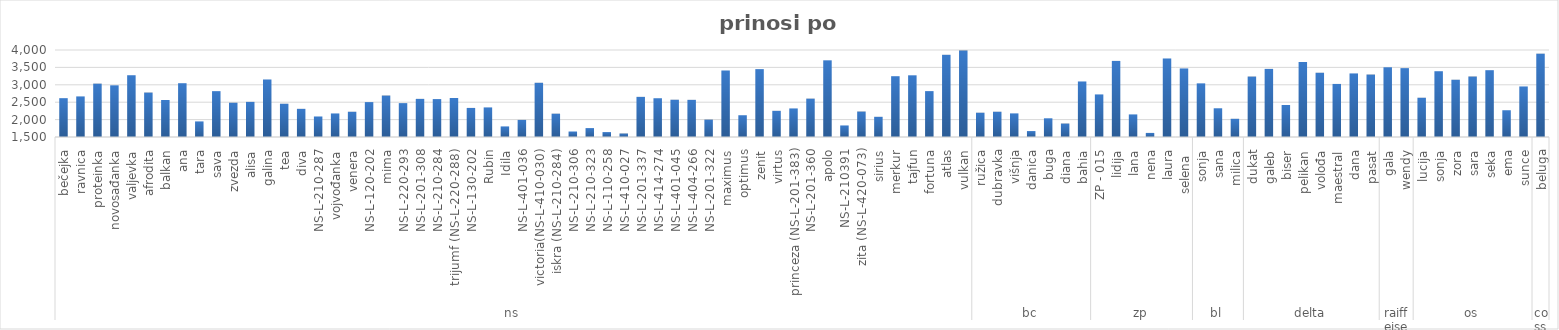
| Category | Series 0 |
|---|---|
| 0 | 2615.836 |
| 1 | 2666.375 |
| 2 | 3033 |
| 3 | 2985 |
| 4 | 3274.849 |
| 5 | 2776.475 |
| 6 | 2563.597 |
| 7 | 3045.533 |
| 8 | 1948.067 |
| 9 | 2817.53 |
| 10 | 2484.667 |
| 11 | 2509.4 |
| 12 | 3152.807 |
| 13 | 2455.667 |
| 14 | 2309.083 |
| 15 | 2089.7 |
| 16 | 2176.988 |
| 17 | 2225.3 |
| 18 | 2502.95 |
| 19 | 2690.633 |
| 20 | 2473.5 |
| 21 | 2595.6 |
| 22 | 2589.7 |
| 23 | 2621.567 |
| 24 | 2335.5 |
| 25 | 2350.175 |
| 26 | 1804.226 |
| 27 | 1991 |
| 28 | 3057.953 |
| 29 | 2169.867 |
| 30 | 1658 |
| 31 | 1756 |
| 32 | 1641 |
| 33 | 1600 |
| 34 | 2653.291 |
| 35 | 2613.821 |
| 36 | 2570.741 |
| 37 | 2567.559 |
| 38 | 1999.275 |
| 39 | 3411.469 |
| 40 | 2125.5 |
| 41 | 3450.5 |
| 42 | 2252 |
| 43 | 2321 |
| 44 | 2602 |
| 45 | 3703.48 |
| 46 | 1832 |
| 47 | 2231 |
| 48 | 2080 |
| 49 | 3246.954 |
| 50 | 3272.827 |
| 51 | 2818.667 |
| 52 | 3861.944 |
| 53 | 3982.56 |
| 54 | 2197.71 |
| 55 | 2225.87 |
| 56 | 2178.6 |
| 57 | 1670.31 |
| 58 | 2037.4 |
| 59 | 1886.2 |
| 60 | 3095.8 |
| 61 | 2723.6 |
| 62 | 3686.6 |
| 63 | 2149.1 |
| 64 | 1617.2 |
| 65 | 3756.5 |
| 66 | 3470.187 |
| 67 | 3041.441 |
| 68 | 2325.336 |
| 69 | 2022.993 |
| 70 | 3236.211 |
| 71 | 3457.004 |
| 72 | 2419 |
| 73 | 3655.597 |
| 74 | 3346.127 |
| 75 | 3025 |
| 76 | 3327 |
| 77 | 3294 |
| 78 | 3503.678 |
| 79 | 3479 |
| 80 | 2627.798 |
| 81 | 3390.209 |
| 82 | 3145.248 |
| 83 | 3237.52 |
| 84 | 3419.849 |
| 85 | 2269 |
| 86 | 2952.667 |
| 87 | 3894.163 |